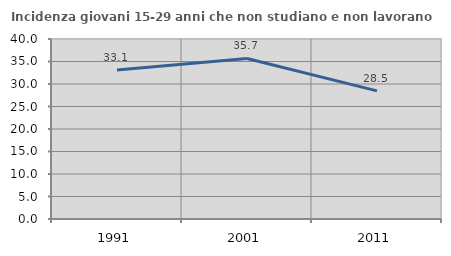
| Category | Incidenza giovani 15-29 anni che non studiano e non lavorano  |
|---|---|
| 1991.0 | 33.1 |
| 2001.0 | 35.681 |
| 2011.0 | 28.481 |